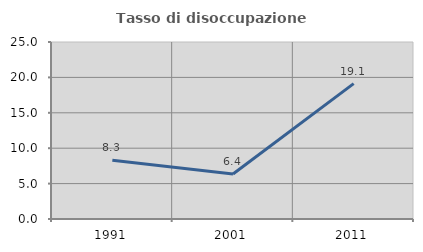
| Category | Tasso di disoccupazione giovanile  |
|---|---|
| 1991.0 | 8.309 |
| 2001.0 | 6.364 |
| 2011.0 | 19.118 |